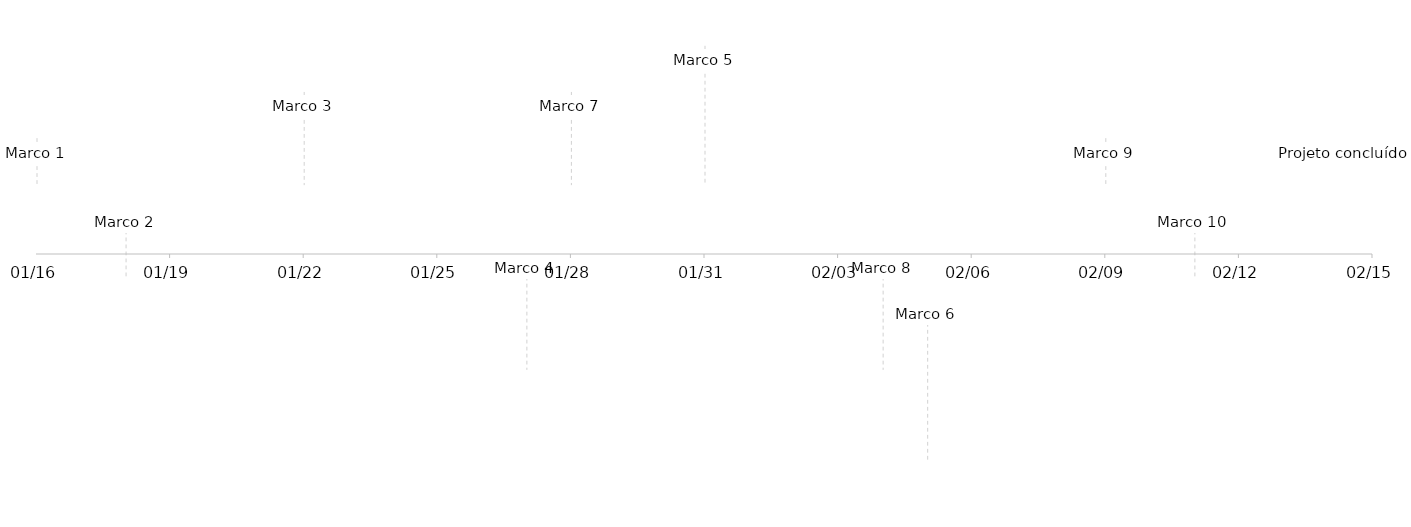
| Category | Series 1 |
|---|---|
| Marco 1 | 5 |
| Marco 2 | -5 |
| Marco 3 | 10 |
| Marco 4 | -10 |
| Marco 5 | 15 |
| Marco 6 | -15 |
| Marco 7 | 10 |
| Marco 8 | -10 |
| Marco 9 | 5 |
| Marco 10 | -5 |
| Projeto concluído | 5 |